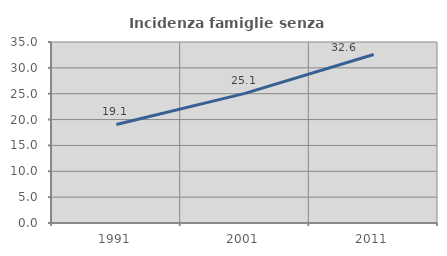
| Category | Incidenza famiglie senza nuclei |
|---|---|
| 1991.0 | 19.063 |
| 2001.0 | 25.066 |
| 2011.0 | 32.584 |